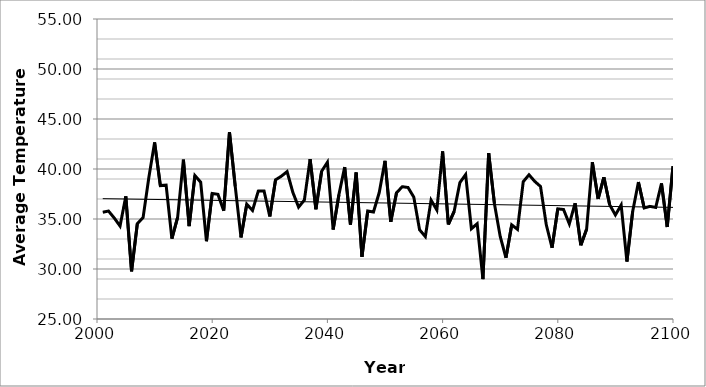
| Category | Committed |
|---|---|
| 2001.0 | 35.677 |
| 2002.0 | 35.794 |
| 2003.0 | 35.096 |
| 2004.0 | 34.295 |
| 2005.0 | 37.272 |
| 2006.0 | 29.77 |
| 2007.0 | 34.533 |
| 2008.0 | 35.136 |
| 2009.0 | 39.144 |
| 2010.0 | 42.663 |
| 2011.0 | 38.34 |
| 2012.0 | 38.383 |
| 2013.0 | 33.03 |
| 2014.0 | 35.166 |
| 2015.0 | 40.932 |
| 2016.0 | 34.291 |
| 2017.0 | 39.348 |
| 2018.0 | 38.685 |
| 2019.0 | 32.778 |
| 2020.0 | 37.553 |
| 2021.0 | 37.461 |
| 2022.0 | 35.836 |
| 2023.0 | 43.696 |
| 2024.0 | 38.26 |
| 2025.0 | 33.159 |
| 2026.0 | 36.484 |
| 2027.0 | 35.854 |
| 2028.0 | 37.789 |
| 2029.0 | 37.803 |
| 2030.0 | 35.256 |
| 2031.0 | 38.919 |
| 2032.0 | 39.276 |
| 2033.0 | 39.74 |
| 2034.0 | 37.666 |
| 2035.0 | 36.187 |
| 2036.0 | 36.894 |
| 2037.0 | 40.986 |
| 2038.0 | 35.974 |
| 2039.0 | 39.771 |
| 2040.0 | 40.674 |
| 2041.0 | 33.944 |
| 2042.0 | 37.436 |
| 2043.0 | 40.195 |
| 2044.0 | 34.446 |
| 2045.0 | 39.648 |
| 2046.0 | 31.222 |
| 2047.0 | 35.802 |
| 2048.0 | 35.699 |
| 2049.0 | 37.647 |
| 2050.0 | 40.815 |
| 2051.0 | 34.714 |
| 2052.0 | 37.62 |
| 2053.0 | 38.23 |
| 2054.0 | 38.149 |
| 2055.0 | 37.191 |
| 2056.0 | 33.924 |
| 2057.0 | 33.242 |
| 2058.0 | 36.885 |
| 2059.0 | 35.901 |
| 2060.0 | 41.761 |
| 2061.0 | 34.452 |
| 2062.0 | 35.753 |
| 2063.0 | 38.629 |
| 2064.0 | 39.445 |
| 2065.0 | 34.03 |
| 2066.0 | 34.525 |
| 2067.0 | 28.992 |
| 2068.0 | 41.583 |
| 2069.0 | 36.532 |
| 2070.0 | 33.256 |
| 2071.0 | 31.125 |
| 2072.0 | 34.417 |
| 2073.0 | 33.964 |
| 2074.0 | 38.734 |
| 2075.0 | 39.421 |
| 2076.0 | 38.759 |
| 2077.0 | 38.253 |
| 2078.0 | 34.426 |
| 2079.0 | 32.119 |
| 2080.0 | 36.016 |
| 2081.0 | 35.949 |
| 2082.0 | 34.513 |
| 2083.0 | 36.576 |
| 2084.0 | 32.371 |
| 2085.0 | 33.973 |
| 2086.0 | 40.68 |
| 2087.0 | 37.009 |
| 2088.0 | 39.178 |
| 2089.0 | 36.437 |
| 2090.0 | 35.4 |
| 2091.0 | 36.406 |
| 2092.0 | 30.745 |
| 2093.0 | 35.762 |
| 2094.0 | 38.692 |
| 2095.0 | 36.104 |
| 2096.0 | 36.262 |
| 2097.0 | 36.156 |
| 2098.0 | 38.559 |
| 2099.0 | 34.207 |
| 2100.0 | 40.275 |